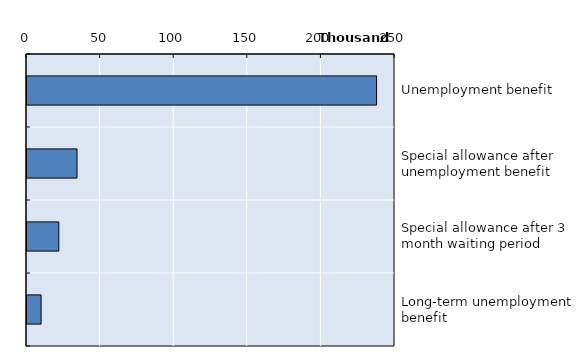
| Category | Series 0 |
|---|---|
| Unemployment benefit | 237464 |
| Special allowance after unemployment benefit | 33971 |
| Special allowance after 3 month waiting period | 21616 |
| Long-term unemployment benefit | 9556 |